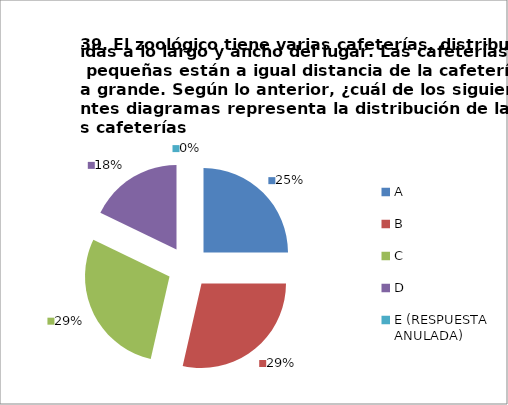
| Category | CANTIDAD DE RESPUESTAS PREGUNTA (39) | PORCENTAJE |
|---|---|---|
| A | 7 | 0.25 |
| B | 8 | 0.286 |
| C | 8 | 0.286 |
| D | 5 | 0.179 |
| E (RESPUESTA ANULADA) | 0 | 0 |